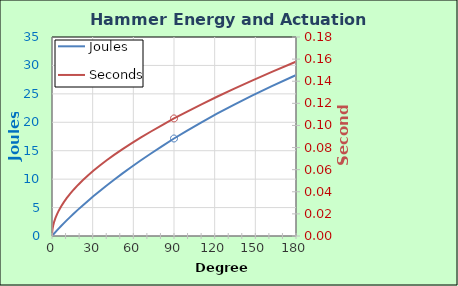
| Category | Joules |
|---|---|
| 0.0 | 0 |
| 0.09444343684549862 | 0.027 |
| 0.38361601923133326 | 0.11 |
| 0.8757174714544345 | 0.247 |
| 1.5794765923756833 | 0.439 |
| 2.504197774741632 | 0.686 |
| 3.659812752451825 | 0.988 |
| 5.056938297048475 | 1.344 |
| 6.706940703539582 | 1.756 |
| 8.622008047417168 | 2.223 |
| 10.815231364493545 | 2.744 |
| 13.300696109335025 | 3.32 |
| 16.093585494669618 | 3.951 |
| 19.21029761337181 | 4.637 |
| 22.668578609469396 | 5.378 |
| 26.487674611716574 | 6.174 |
| 30.68850569410653 | 7.024 |
| 35.293865810138485 | 7.93 |
| 40.32865349818069 | 8.89 |
| 45.82013922193747 | 9.905 |
| 51.79827655666176 | 10.975 |
| 58.29606614383621 | 12.1 |
| 65.3499835300727 | 13.28 |
| 73.0004848374984 | 14.515 |
| 81.29260789995638 | 15.805 |
| 90.0 | 17.149 |
| 99.73254917967962 | 18.549 |
| 110.27728648879112 | 20.003 |
| 121.70643526957845 | 21.512 |
| 134.10230257132218 | 23.076 |
| 147.55924832833267 | 24.695 |
| 162.1861600045774 | 26.369 |
| 178.10959686793464 | 28.097 |
| 195.47783383660325 | 29.881 |
| 214.46613258150057 | 0 |
| 235.2837158789229 | 0 |
| 258.1831515686439 | 0 |
| 283.4732197700396 | 0 |
| 311.53694022207355 | 0 |
| 342.85746120954536 | 0 |
| 378.05632063186056 | 0 |
| 417.95193130730274 | 0 |
| 463.6526517462205 | 0 |
| 516.712318110817 | 0 |
| 579.4064521025932 | 0 |
| 655.2625044918817 | 0 |
| 750.1891083572513 | 0 |
| 875.2604930443284 | 0 |
| 1055.3296384434016 | 0 |
| 1369.6405123015186 | 0 |
| 1688.8118635904311 | 0 |
| 2007.9832148793437 | 0 |
| 2327.154566168256 | 0 |
| 2646.325917457169 | 0 |
| 2965.4972687460818 | 0 |
| 3284.6686200349945 | 0 |